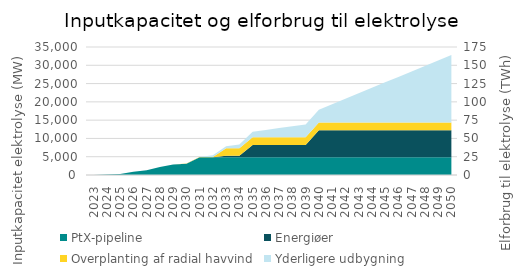
| Category | Elforbrug til PtX |
|---|---|
| 2023.0 | 0.025 |
| 2024.0 | 0.545 |
| 2025.0 | 1.265 |
| 2026.0 | 4.375 |
| 2027.0 | 6.648 |
| 2028.0 | 10.895 |
| 2029.0 | 14.518 |
| 2030.0 | 15.818 |
| 2031.0 | 24.65 |
| 2032.0 | 27.15 |
| 2033.0 | 39.15 |
| 2034.0 | 41.65 |
| 2035.0 | 59.15 |
| 2036.0 | 61.65 |
| 2037.0 | 64.15 |
| 2038.0 | 66.65 |
| 2039.0 | 69.15 |
| 2040.0 | 89.15 |
| 2041.0 | 96.538 |
| 2042.0 | 103.925 |
| 2043.0 | 111.312 |
| 2044.0 | 118.7 |
| 2045.0 | 126.088 |
| 2046.0 | 133.475 |
| 2047.0 | 140.862 |
| 2048.0 | 148.25 |
| 2049.0 | 155.638 |
| 2050.0 | 163.025 |